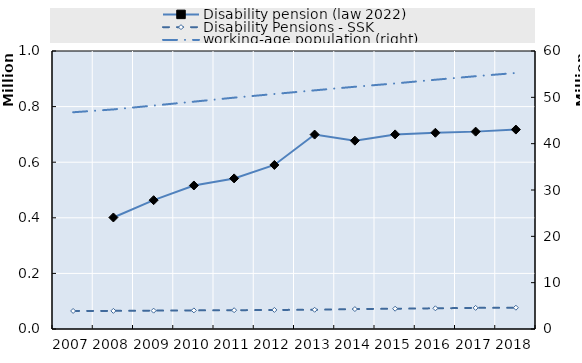
| Category | Disability pension (law 2022) | Disability Pensions - SSK |
|---|---|---|
| 2007.0 | 0 | 64883 |
| 2008.0 | 401141 | 65175 |
| 2009.0 | 463363 | 66038 |
| 2010.0 | 516246 | 66902 |
| 2011.0 | 541705 | 67575 |
| 2012.0 | 590041 | 68593 |
| 2013.0 | 699397 | 69153 |
| 2014.0 | 677532 | 71688 |
| 2015.0 | 700027 | 73004 |
| 2016.0 | 705887 | 74429 |
| 2017.0 | 709981 | 75978 |
| 2018.0 | 717352 | 76554 |